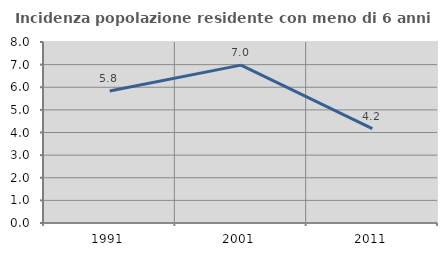
| Category | Incidenza popolazione residente con meno di 6 anni |
|---|---|
| 1991.0 | 5.832 |
| 2001.0 | 6.979 |
| 2011.0 | 4.17 |